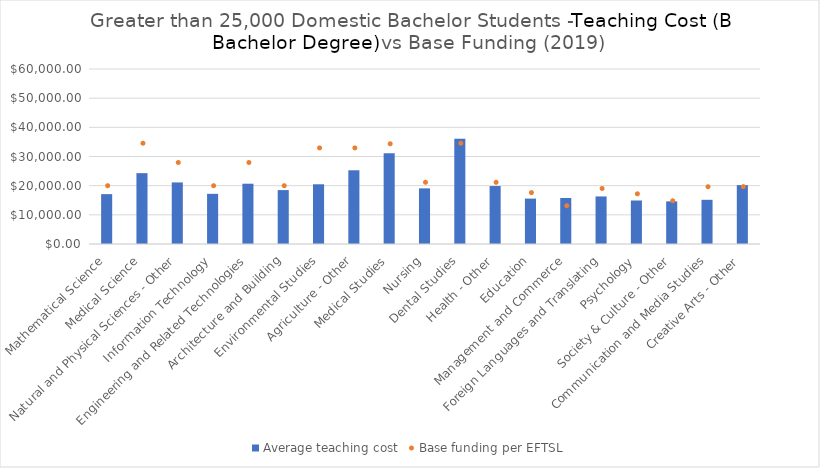
| Category | Average teaching cost |
|---|---|
| Mathematical Science | 17093.921 |
| Medical Science | 24288.058 |
| Natural and Physical Sciences - Other | 21111.923 |
| Information Technology | 17197.356 |
| Engineering and Related Technologies | 20670.806 |
| Architecture and Building | 18489.496 |
| Environmental Studies | 20473.341 |
| Agriculture - Other | 25275.092 |
| Medical Studies | 31130.841 |
| Nursing | 19072.117 |
| Dental Studies | 36110.142 |
| Health - Other | 19873.463 |
| Education | 15567.535 |
| Management and Commerce | 15777.077 |
| Foreign Languages and Translating | 16306.223 |
| Psychology | 14916.606 |
| Society & Culture - Other | 14617.578 |
| Communication and Media Studies | 15150.555 |
| Creative Arts - Other | 20189.94 |